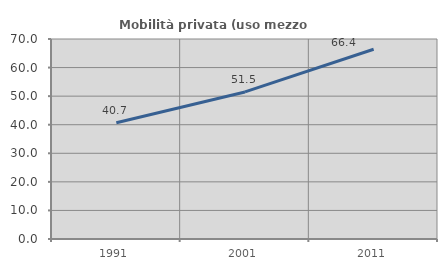
| Category | Mobilità privata (uso mezzo privato) |
|---|---|
| 1991.0 | 40.708 |
| 2001.0 | 51.477 |
| 2011.0 | 66.4 |